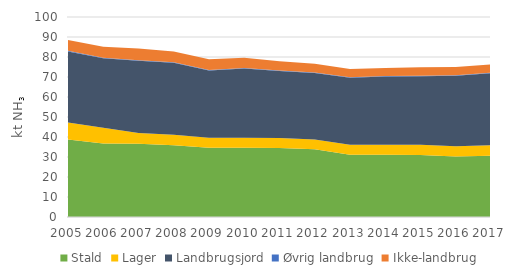
| Category | Stald | Lager | Landbrugsjord | Øvrig landbrug | Ikke-landbrug |
|---|---|---|---|---|---|
| 2005.0 | 38.762 | 8.461 | 35.51 | 0.387 | 5.405 |
| 2006.0 | 36.736 | 7.932 | 34.653 | 0.287 | 5.476 |
| 2007.0 | 36.6 | 5.365 | 36.172 | 0.269 | 5.805 |
| 2008.0 | 35.891 | 5.239 | 35.97 | 0.261 | 5.437 |
| 2009.0 | 34.589 | 5.014 | 33.669 | 0.279 | 5.291 |
| 2010.0 | 34.625 | 5.038 | 34.607 | 0.246 | 5.121 |
| 2011.0 | 34.5 | 4.99 | 33.486 | 0.245 | 4.689 |
| 2012.0 | 33.901 | 4.901 | 33.192 | 0.259 | 4.39 |
| 2013.0 | 31.106 | 5.014 | 33.445 | 0.267 | 4.217 |
| 2014.0 | 31.072 | 5.116 | 34.066 | 0.265 | 3.995 |
| 2015.0 | 31 | 5.116 | 34.209 | 0.252 | 4.348 |
| 2016.0 | 30.242 | 5.159 | 35.201 | 0.251 | 4.134 |
| 2017.0 | 30.689 | 5.241 | 36.023 | 0.262 | 4.116 |